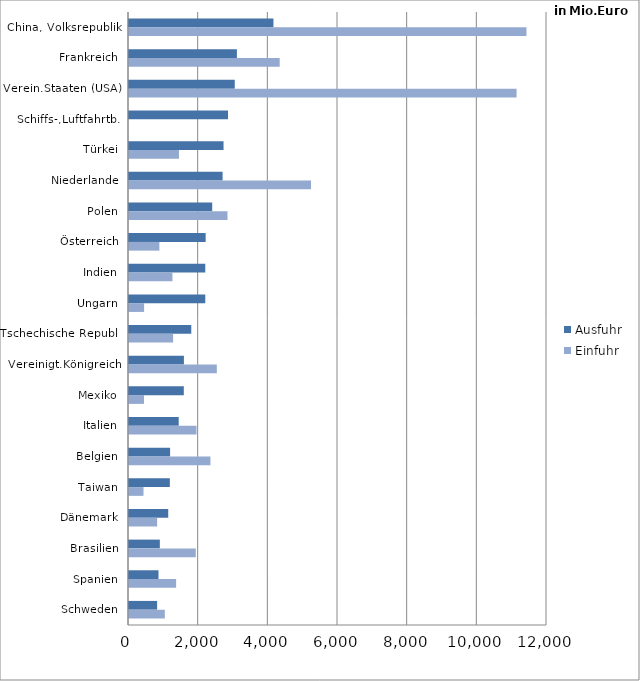
| Category | Ausfuhr | Einfuhr |
|---|---|---|
| China, Volksrepublik | 4146.9 | 11410.217 |
| Frankreich | 3097.563 | 4326.224 |
| Verein.Staaten (USA) | 3035.846 | 11126.493 |
| Schiffs-,Luftfahrtb. | 2843.029 | 0 |
| Türkei | 2714.051 | 1434.8 |
| Niederlande | 2686.485 | 5225.056 |
| Polen | 2388.794 | 2827.469 |
| Österreich | 2200.818 | 871.78 |
| Indien | 2189.637 | 1247.548 |
| Ungarn | 2189.49 | 433.615 |
| Tschechische Republ. | 1787.739 | 1266.35 |
| Vereinigt.Königreich | 1576.404 | 2521.13 |
| Mexiko | 1573.004 | 430.632 |
| Italien | 1427.056 | 1937.438 |
| Belgien | 1180.32 | 2337.857 |
| Taiwan | 1172.569 | 416.12 |
| Dänemark | 1126.493 | 807.743 |
| Brasilien | 885.207 | 1917.28 |
| Spanien | 846.77 | 1353.021 |
| Schweden | 807.222 | 1028.366 |